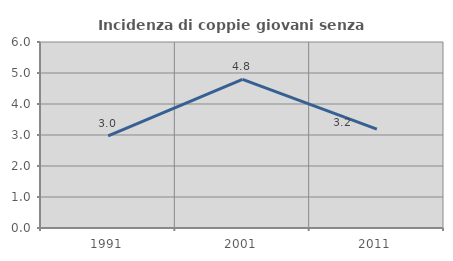
| Category | Incidenza di coppie giovani senza figli |
|---|---|
| 1991.0 | 2.974 |
| 2001.0 | 4.797 |
| 2011.0 | 3.187 |